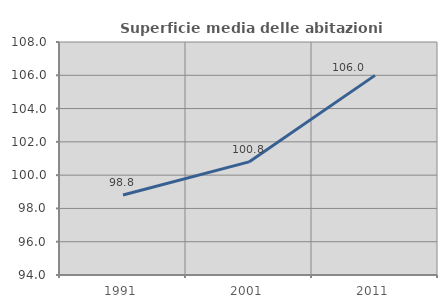
| Category | Superficie media delle abitazioni occupate |
|---|---|
| 1991.0 | 98.808 |
| 2001.0 | 100.794 |
| 2011.0 | 105.995 |